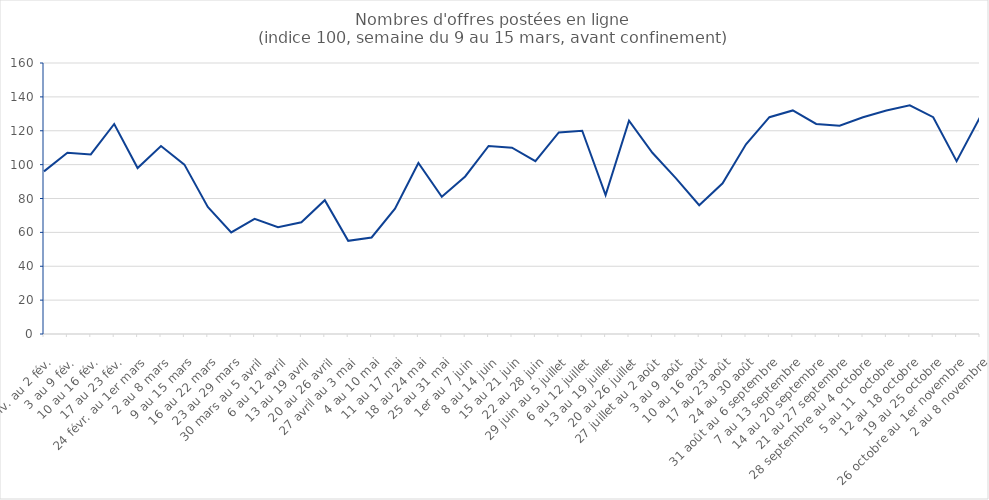
| Category | Series 0 |
|---|---|
| 27 janv. au 2 fév. | 96 |
| 3 au 9 fév. | 107 |
| 10 au 16 fév. | 106 |
| 17 au 23 fév. | 124 |
| 24 févr. au 1er mars | 98 |
| 2 au 8 mars | 111 |
| 9 au 15 mars | 100 |
| 16 au 22 mars | 75 |
| 23 au 29 mars | 60 |
| 30 mars au 5 avril | 68 |
| 6 au 12 avril | 63 |
| 13 au 19 avril | 66 |
| 20 au 26 avril | 79 |
| 27 avril au 3 mai | 55 |
| 4 au 10 mai | 57 |
| 11 au 17 mai | 74 |
| 18 au 24 mai | 101 |
| 25 au 31 mai | 81 |
| 1er au 7 juin | 93 |
| 8 au 14 juin | 111 |
| 15 au 21 juin | 110 |
| 22 au 28 juin | 102 |
| 29 juin au 5 juillet | 119 |
| 6 au 12 juillet | 120 |
| 13 au 19 juillet | 82 |
| 20 au 26 juillet | 126 |
| 27 juillet au 2 août | 107 |
| 3 au 9 août | 92 |
| 10 au 16 août | 76 |
| 17 au 23 août | 89 |
| 24 au 30 août | 112 |
| 31 août au 6 septembre | 128 |
| 7 au 13 septembre | 132 |
| 14 au 20 septembre | 124 |
| 21 au 27 septembre | 123 |
| 28 septembre au 4 octobre | 128 |
| 5 au 11  octobre | 132 |
| 12 au 18 octobre | 135 |
| 19 au 25 octobre | 128 |
| 26 octobre au 1er novembre | 102 |
| 2 au 8 novembre | 128 |